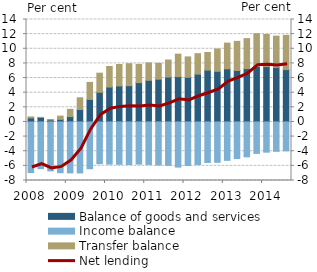
| Category | Balance of goods and services | Income balance | Transfer balance |
|---|---|---|---|
| 2008.0 | 0.547 | -6.918 | 0.145 |
| 2008.0 | 0.613 | -6.375 | 0.016 |
| 2008.0 | 0.278 | -6.687 | 0.057 |
| 2008.0 | 0.359 | -6.936 | 0.438 |
| 2009.0 | 0.731 | -6.96 | 0.991 |
| 2009.0 | 1.705 | -6.966 | 1.597 |
| 2009.0 | 3.081 | -6.394 | 2.328 |
| 2009.0 | 4.056 | -5.703 | 2.608 |
| 2010.0 | 4.769 | -5.764 | 2.812 |
| 2010.0 | 4.923 | -5.79 | 2.925 |
| 2010.0 | 4.955 | -5.811 | 3.006 |
| 2010.0 | 5.378 | -5.755 | 2.494 |
| 2011.0 | 5.69 | -5.809 | 2.377 |
| 2011.0 | 5.84 | -5.881 | 2.167 |
| 2011.0 | 6.134 | -5.931 | 2.331 |
| 2011.0 | 6.192 | -6.168 | 3.073 |
| 2012.0 | 6.104 | -5.951 | 2.783 |
| 2012.0 | 6.536 | -5.81 | 2.793 |
| 2012.0 | 7.084 | -5.536 | 2.41 |
| 2012.0 | 6.916 | -5.512 | 3.053 |
| 2013.0 | 7.264 | -5.245 | 3.511 |
| 2013.0 | 7.027 | -5.001 | 3.983 |
| 2013.0 | 7.286 | -4.767 | 4.101 |
| 2013.0 | 7.587 | -4.297 | 4.475 |
| 2014.0 | 7.56 | -4.13 | 4.393 |
| 2014.0 | 7.45 | -4.014 | 4.272 |
| 2014.0 | 7.153 | -3.948 | 4.677 |